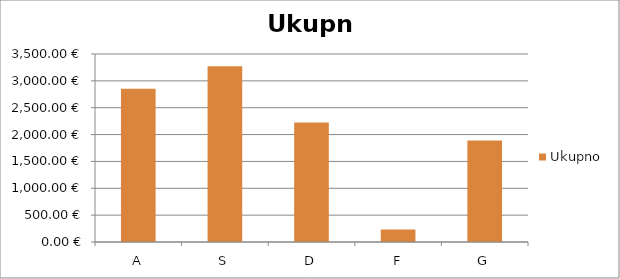
| Category | Ukupno |
|---|---|
| A | 2854.368 |
| S | 3274.128 |
| D | 2224.728 |
| F | 230.868 |
| G | 1888.92 |